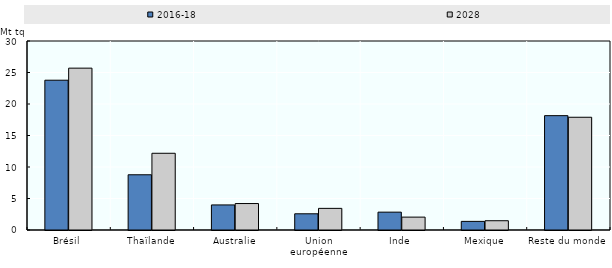
| Category | 2016-18 | 2028 |
|---|---|---|
| Brésil | 23.775 | 25.69 |
| Thaïlande | 8.766 | 12.178 |
| Australie | 3.978 | 4.201 |
| Union européenne | 2.574 | 3.435 |
| Inde | 2.834 | 2.046 |
| Mexique | 1.367 | 1.472 |
| Reste du monde | 18.151 | 17.896 |